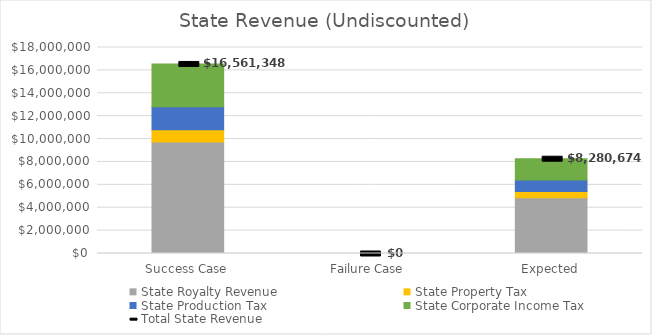
| Category | State Royalty Revenue | State Property Tax | State Production Tax | State Corporate Income Tax |
|---|---|---|---|---|
| Success Case | 9735000 | 1080600.267 | 2010277.5 | 3735470.496 |
| Failure Case | 0 | 0 | 0 | 0 |
| Expected | 4867500 | 540300.133 | 1005138.75 | 1867735.248 |